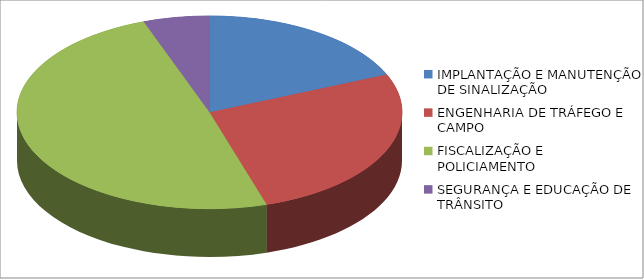
| Category | Series 0 | Series 1 |
|---|---|---|
| IMPLANTAÇÃO E MANUTENÇÃO DE SINALIZAÇÃO | 2281538.95 |  |
| ENGENHARIA DE TRÁFEGO E CAMPO | 3275654.08 |  |
| FISCALIZAÇÃO E POLICIAMENTO | 6050051.46 |  |
| SEGURANÇA E EDUCAÇÃO DE TRÂNSITO | 681704.07 |  |